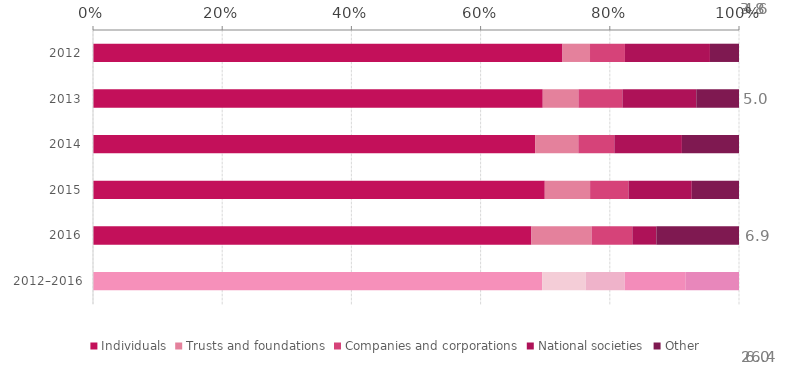
| Category | Individuals | Trusts and foundations | Companies and corporations | National societies | Other |
|---|---|---|---|---|---|
| 2012 | 0.727 | 0.043 | 0.054 | 0.132 | 0.045 |
| 2013 | 0.696 | 0.055 | 0.068 | 0.114 | 0.066 |
| 2014 | 0.684 | 0.067 | 0.056 | 0.105 | 0.088 |
| 2015 | 0.699 | 0.07 | 0.059 | 0.098 | 0.073 |
| 2016 | 0.679 | 0.093 | 0.063 | 0.037 | 0.128 |
| 2012–2016 | 0.695 | 0.067 | 0.06 | 0.095 | 0.082 |